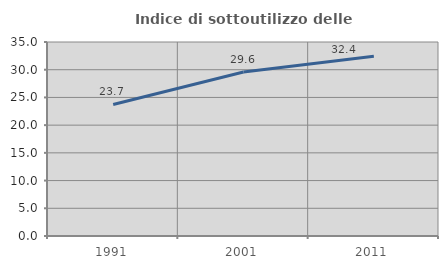
| Category | Indice di sottoutilizzo delle abitazioni  |
|---|---|
| 1991.0 | 23.735 |
| 2001.0 | 29.579 |
| 2011.0 | 32.445 |